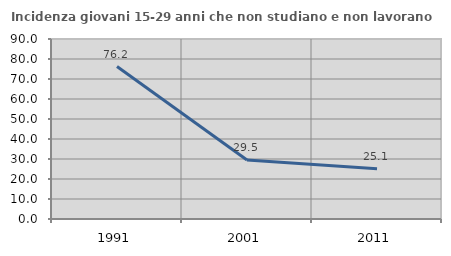
| Category | Incidenza giovani 15-29 anni che non studiano e non lavorano  |
|---|---|
| 1991.0 | 76.213 |
| 2001.0 | 29.487 |
| 2011.0 | 25.111 |